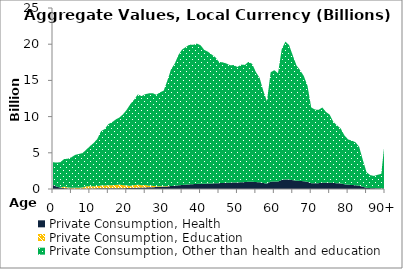
| Category | Private Consumption, Health | Private Consumption, Education | Private Consumption, Other than health and education |
|---|---|---|---|
| 0 | 554.851 | 0 | 3143.133 |
|  | 322.368 | 0 | 3323.062 |
| 2 | 187.704 | 0 | 3521.147 |
| 3 | 117.6 | 208.79 | 3805.191 |
| 4 | 81.673 | 134.091 | 3965.244 |
| 5 | 62.587 | 102.637 | 4214.279 |
| 6 | 0 | 172.143 | 4538.153 |
| 7 | 0 | 168.23 | 4668.406 |
| 8 | 43.814 | 163.56 | 4751.502 |
| 9 | 47.996 | 314.87 | 5059.877 |
| 10 | 54.978 | 320.49 | 5535.117 |
| 11 | 71.522 | 311.595 | 5961.91 |
| 12 | 91.828 | 312.512 | 6500.749 |
| 13 | 109.967 | 372.977 | 7497.723 |
| 14 | 109.724 | 373.38 | 7790.579 |
| 15 | 107.934 | 424.97 | 8428.607 |
| 16 | 97.052 | 426.814 | 8703.443 |
| 17 | 92.951 | 465.25 | 9043.221 |
| 18 | 97.783 | 513.962 | 9265.037 |
| 19 | 108.58 | 409.866 | 9809.018 |
| 20 | 124.048 | 359.951 | 10471.31 |
| 21 | 148.05 | 289.798 | 11308.461 |
| 22 | 166.798 | 351.952 | 11821.857 |
| 23 | 187.327 | 410.847 | 12469.317 |
| 24 | 198.052 | 322.641 | 12313.891 |
| 25 | 217.696 | 330.998 | 12546.958 |
| 26 | 236.335 | 221.794 | 12753.494 |
| 27 | 253.207 | 185.351 | 12802.932 |
| 28 | 264.063 | 119.8 | 12630.702 |
| 29 | 285.999 | 101.506 | 12961.974 |
| 30 | 306.646 | 62.554 | 13212.924 |
| 31 | 355.542 | 63.76 | 14547.371 |
| 32 | 413.329 | 0 | 16118.406 |
| 33 | 451.657 | 0 | 16857.971 |
| 34 | 506.984 | 0 | 18001.059 |
| 35 | 556.924 | 0 | 18713.013 |
| 36 | 595.503 | 0 | 19004.204 |
| 37 | 636.384 | 0 | 19317.717 |
| 38 | 668.554 | 0 | 19243.263 |
| 39 | 705.069 | 0 | 19381.582 |
| 40 | 718.442 | 0 | 19136.063 |
| 41 | 722.001 | 0 | 18489.074 |
| 42 | 745.375 | 0 | 18220.247 |
| 43 | 763.398 | 0 | 17813.539 |
| 44 | 784.452 | 0 | 17426.196 |
| 45 | 800.836 | 0 | 16752.719 |
| 46 | 839.724 | 0 | 16650.712 |
| 47 | 862.938 | 0 | 16469.955 |
| 48 | 875.372 | 0 | 16227.757 |
| 49 | 896.545 | 0 | 16216.89 |
| 50 | 897.288 | 0 | 15958.486 |
| 51 | 931.884 | 0 | 16249.268 |
| 52 | 952.635 | 0 | 16185.777 |
| 53 | 1002.524 | 0 | 16562.345 |
| 54 | 1005.34 | 0 | 16265.813 |
| 55 | 957.574 | 0 | 15192.759 |
| 56 | 924.972 | 0 | 14441.393 |
| 57 | 828.805 | 0 | 12750.238 |
| 58 | 746.45 | 0 | 11362.295 |
| 59 | 1008.06 | 0 | 15115.918 |
| 60 | 1040.631 | 0 | 15368.24 |
| 61 | 1025.045 | 0 | 14959.911 |
| 62 | 1248.745 | 0 | 18074.748 |
| 63 | 1327.256 | 0 | 19029.51 |
| 64 | 1306.824 | 0 | 18577.276 |
| 65 | 1220.415 | 0 | 17227.199 |
| 66 | 1143.527 | 0 | 15931.851 |
| 67 | 1116.17 | 0 | 15295.986 |
| 68 | 1072.542 | 0 | 14518.244 |
| 69 | 990.406 | 0 | 13244.989 |
| 70 | 796.203 | 0 | 10463.285 |
| 71 | 792.344 | 0 | 10187.207 |
| 72 | 807.642 | 0 | 10121.99 |
| 73 | 865.262 | 0 | 10396.521 |
| 74 | 860.882 | 0 | 9781.193 |
| 75 | 875.99 | 0 | 9402.456 |
| 76 | 824.595 | 0 | 8456.888 |
| 77 | 801.884 | 0 | 7992.588 |
| 78 | 761.053 | 0 | 7592.341 |
| 79 | 655.276 | 0 | 6744.705 |
| 80 | 587.333 | 0 | 6257.346 |
| 81 | 551.859 | 0 | 6126.513 |
| 82 | 518.154 | 0 | 5940.302 |
| 83 | 451.848 | 0 | 5367.565 |
| 84 | 303.465 | 0 | 3697.886 |
| 85 | 166.779 | 0 | 2151.099 |
| 86 | 118.555 | 0 | 1800.532 |
| 87 | 92.064 | 0 | 1712.68 |
| 88 | 82.649 | 0 | 1882.317 |
| 89 | 72.556 | 0 | 2020.547 |
| 90+ | 0 | 0 | 6983.164 |